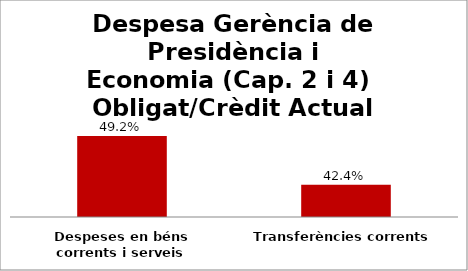
| Category | Series 0 |
|---|---|
| Despeses en béns corrents i serveis | 0.492 |
| Transferències corrents | 0.424 |